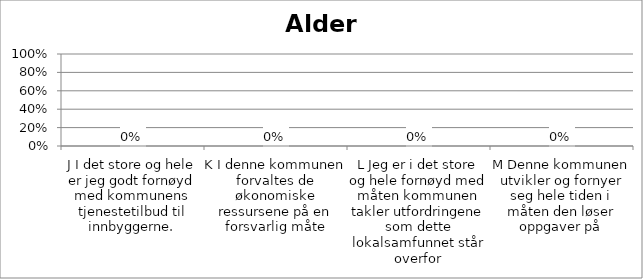
| Category | Series 0 |
|---|---|
| J I det store og hele er jeg godt fornøyd med kommunens tjenestetilbud til innbyggerne. | 0 |
| K I denne kommunen forvaltes de økonomiske ressursene på en forsvarlig måte | 0 |
| L Jeg er i det store og hele fornøyd med måten kommunen takler utfordringene som dette lokalsamfunnet står overfor | 0 |
| M Denne kommunen utvikler og fornyer seg hele tiden i måten den løser oppgaver på | 0 |